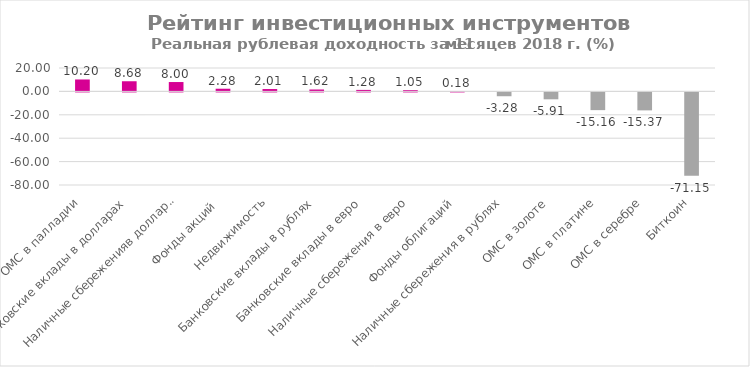
| Category | Реальная рублевая доходность с начала 2018 года (%%) |
|---|---|
| ОМС в палладии | 10.196 |
| Банковские вклады в долларах | 8.677 |
| Наличные сбереженияв долларах | 8.003 |
| Фонды акций  | 2.283 |
| Недвижимость | 2.012 |
| Банковские вклады в рублях | 1.625 |
| Банковские вклады в евро | 1.28 |
| Наличные сбережения в евро | 1.05 |
| Фонды облигаций | 0.184 |
| Наличные сбережения в рублях | -3.279 |
| ОМС в золоте | -5.905 |
| ОМС в платине | -15.155 |
| ОМС в серебре | -15.369 |
| Биткоин | -71.155 |